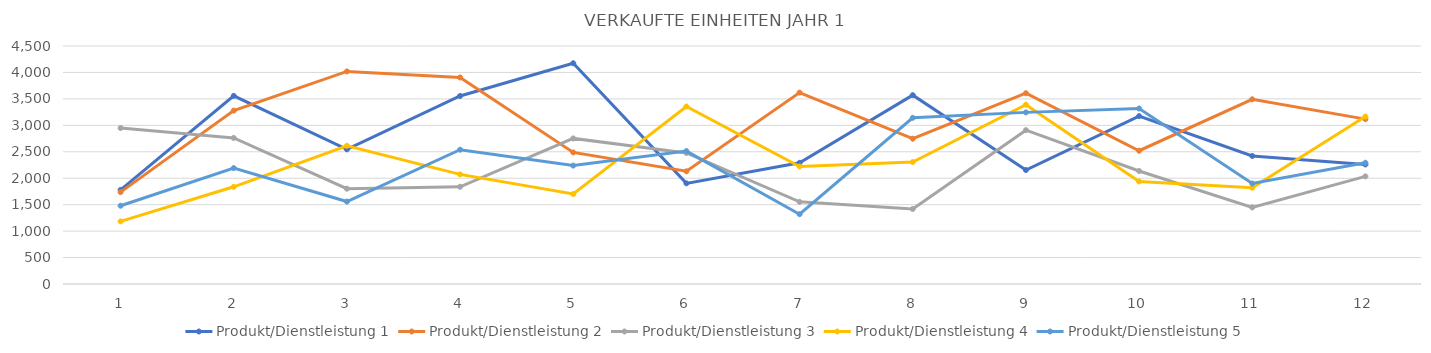
| Category | Produkt/Dienstleistung 1 | Produkt/Dienstleistung 2 | Produkt/Dienstleistung 3 | Produkt/Dienstleistung 4 | Produkt/Dienstleistung 5 |
|---|---|---|---|---|---|
| 0 | 1779 | 1737 | 2949 | 1184 | 1480 |
| 1 | 3557 | 3279 | 2762 | 1838 | 2192 |
| 2 | 2546 | 4019 | 1802 | 2613 | 1559 |
| 3 | 3555 | 3905 | 1838 | 2073 | 2539 |
| 4 | 4174 | 2488 | 2753 | 1702 | 2239 |
| 5 | 1903 | 2131 | 2478 | 3356 | 2513 |
| 6 | 2291 | 3619 | 1553 | 2222 | 1320 |
| 7 | 3571 | 2747 | 1419 | 2305 | 3142 |
| 8 | 2155 | 3607 | 2909 | 3390 | 3245 |
| 9 | 3174 | 2520 | 2137 | 1939 | 3318 |
| 10 | 2420 | 3492 | 1448 | 1819 | 1900 |
| 11 | 2260 | 3117 | 2035 | 3166 | 2292 |